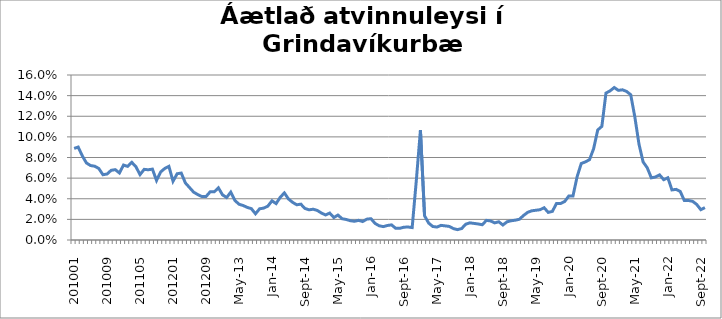
| Category | Series 0 |
|---|---|
| 201001 | 0.089 |
| 201002 | 0.09 |
| 201003 | 0.082 |
| 201004 | 0.075 |
| 201005 | 0.072 |
| 201006 | 0.072 |
| 201007 | 0.069 |
| 201008 | 0.063 |
| 201009 | 0.064 |
| 201010 | 0.068 |
| 201011 | 0.068 |
| 201012 | 0.065 |
| 201101 | 0.073 |
| 201102 | 0.071 |
| 201103 | 0.075 |
| 201104 | 0.071 |
| 201105 | 0.063 |
| 201106 | 0.069 |
| 201107 | 0.068 |
| 201108 | 0.069 |
| 201109 | 0.058 |
| 201110 | 0.066 |
| 201111 | 0.069 |
| 201112 | 0.071 |
| 201201 | 0.057 |
| 201202 | 0.064 |
| 201203 | 0.065 |
| 201204 | 0.055 |
| 201205 | 0.051 |
| 201206 | 0.046 |
| 201207 | 0.044 |
| 201208 | 0.042 |
| 201209 | 0.042 |
| 201210 | 0.047 |
| 201211 | 0.047 |
| 201212 | 0.051 |
| jan.13 | 0.044 |
| feb.13 | 0.041 |
| mar.13 | 0.046 |
| apr.13 | 0.038 |
| maí.13 | 0.035 |
| jún.13 | 0.033 |
| júl.13 | 0.032 |
| ágú.13 | 0.03 |
| sep.13 | 0.025 |
| okt.13 | 0.03 |
| nóv.13 | 0.031 |
| des.13 | 0.033 |
| jan.14 | 0.038 |
| feb.14 | 0.035 |
| mar.14 | 0.041 |
| apr.14 | 0.046 |
| maí.14 | 0.04 |
| jún.14 | 0.037 |
| júl.14 | 0.034 |
| ágú.14 | 0.035 |
| sep.14 | 0.031 |
| okt.14 | 0.029 |
| nóv.14 | 0.03 |
| des.14 | 0.029 |
| jan.15 | 0.026 |
| feb.15 | 0.024 |
| mar.15 | 0.026 |
| apr.15 | 0.022 |
| maí.15 | 0.024 |
| jún.15 | 0.021 |
| júl.15 | 0.02 |
| ágú.15 | 0.019 |
| sep.15 | 0.018 |
| okt.15 | 0.019 |
| nóv.15 | 0.018 |
| des.15 | 0.02 |
| jan.16 | 0.021 |
| feb.16 | 0.016 |
| mar.16 | 0.014 |
| apr.16 | 0.013 |
| maí.16 | 0.014 |
| jún.16 | 0.015 |
| júl.16 | 0.011 |
| ágú.16 | 0.011 |
| sep.16 | 0.012 |
| okt.16 | 0.013 |
| nóv.16 | 0.012 |
| des.16 | 0.058 |
| jan.17 | 0.106 |
| feb.17 | 0.023 |
| mar.17 | 0.016 |
| apr.17 | 0.013 |
| maí.17 | 0.013 |
| jún.17 | 0.014 |
| júl.17 | 0.014 |
| ágú.17 | 0.013 |
| sep.17 | 0.011 |
| okt.17 | 0.01 |
| nóv.17 | 0.011 |
| des.17 | 0.015 |
| jan.18 | 0.017 |
| feb.18 | 0.016 |
| mar.18 | 0.016 |
| apr.18 | 0.015 |
| maí.18 | 0.019 |
| jún.18 | 0.018 |
| júl.18 | 0.017 |
| ágú.18 | 0.018 |
| sep.18 | 0.015 |
| okt.18 | 0.018 |
| nóv.18 | 0.019 |
| des.18 | 0.019 |
| jan.19 | 0.02 |
| feb.19 | 0.024 |
| mar.19 | 0.027 |
| apr.19 | 0.028 |
| maí.19 | 0.029 |
| jún.19 | 0.029 |
| júl.19 | 0.031 |
| ágú.19 | 0.027 |
| sep.19 | 0.028 |
| okt.19 | 0.035 |
| nóv.19 | 0.035 |
| des.19 | 0.037 |
| jan.20 | 0.043 |
| feb.20 | 0.043 |
| mars 2020 *** | 0.061 |
| apr.20 | 0.074 |
| maí.20 | 0.076 |
| jún.20 | 0.078 |
| júl.20 | 0.088 |
| ágú.20 | 0.107 |
| sep.20 | 0.11 |
| okt.20 | 0.142 |
| nóv.20 | 0.145 |
| des.20 | 0.148 |
| jan.21 | 0.145 |
| feb.21 | 0.146 |
| mar.21 | 0.144 |
| apr.21 | 0.141 |
| maí.21 | 0.119 |
| jún.21 | 0.093 |
| júl.21 | 0.076 |
| ágú.21 | 0.07 |
| sep.21 | 0.06 |
| okt.21 | 0.061 |
| nóv.21 | 0.063 |
| des.21 | 0.058 |
| jan.22 | 0.06 |
| feb.22 | 0.049 |
| mar.22 | 0.049 |
| apr.22 | 0.047 |
| maí.22 | 0.038 |
| jún.22 | 0.038 |
| júl.22 | 0.038 |
| ágú.22 | 0.034 |
| sep.22 | 0.029 |
| okt.22 | 0.031 |